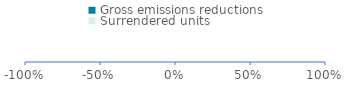
| Category | Gross emissions reductions | Surrendered units |
|---|---|---|
| 0 | 0 | 0 |